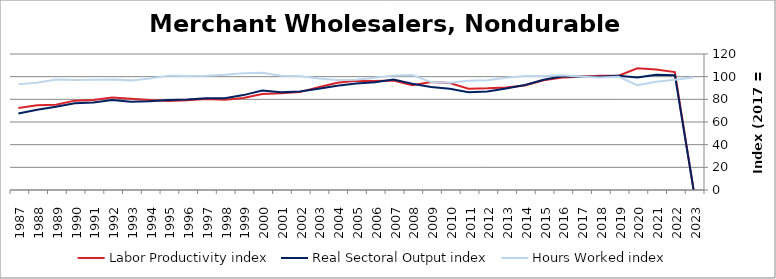
| Category | Labor Productivity index | Real Sectoral Output index | Hours Worked index |
|---|---|---|---|
| 2023.0 | 0 | 0 | 99.53 |
| 2022.0 | 104.025 | 101.293 | 97.374 |
| 2021.0 | 106.41 | 101.726 | 95.598 |
| 2020.0 | 107.402 | 99.313 | 92.469 |
| 2019.0 | 100.896 | 100.84 | 99.945 |
| 2018.0 | 100.706 | 99.887 | 99.187 |
| 2017.0 | 100 | 100 | 100 |
| 2016.0 | 99.19 | 100.403 | 101.223 |
| 2015.0 | 96.802 | 97.285 | 100.499 |
| 2014.0 | 92.112 | 92.62 | 100.551 |
| 2013.0 | 90.381 | 89.476 | 98.999 |
| 2012.0 | 89.7 | 86.911 | 96.89 |
| 2011.0 | 89.43 | 86.281 | 96.479 |
| 2010.0 | 94.36 | 89.34 | 94.68 |
| 2009.0 | 95.336 | 90.788 | 95.23 |
| 2008.0 | 92.34 | 93.686 | 101.457 |
| 2007.0 | 96.525 | 97.557 | 101.069 |
| 2006.0 | 96.084 | 95.156 | 99.034 |
| 2005.0 | 96.456 | 93.902 | 97.352 |
| 2004.0 | 94.642 | 91.921 | 97.124 |
| 2003.0 | 90.679 | 89.306 | 98.487 |
| 2002.0 | 86.377 | 86.834 | 100.529 |
| 2001.0 | 85.384 | 86.163 | 100.912 |
| 2000.0 | 84.682 | 87.689 | 103.552 |
| 1999.0 | 81.236 | 83.734 | 103.075 |
| 1998.0 | 79.606 | 81.014 | 101.769 |
| 1997.0 | 80.345 | 81.015 | 100.834 |
| 1996.0 | 79.255 | 79.782 | 100.665 |
| 1995.0 | 78.588 | 79.305 | 100.913 |
| 1994.0 | 79.441 | 78.207 | 98.447 |
| 1993.0 | 80.546 | 77.912 | 96.729 |
| 1992.0 | 81.537 | 79.47 | 97.465 |
| 1991.0 | 79.376 | 77.152 | 97.199 |
| 1990.0 | 78.849 | 76.575 | 97.116 |
| 1989.0 | 75.264 | 73.423 | 97.553 |
| 1988.0 | 74.776 | 70.809 | 94.695 |
| 1987.0 | 72.347 | 67.585 | 93.417 |